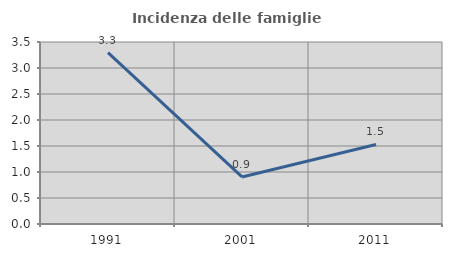
| Category | Incidenza delle famiglie numerose |
|---|---|
| 1991.0 | 3.295 |
| 2001.0 | 0.905 |
| 2011.0 | 1.53 |